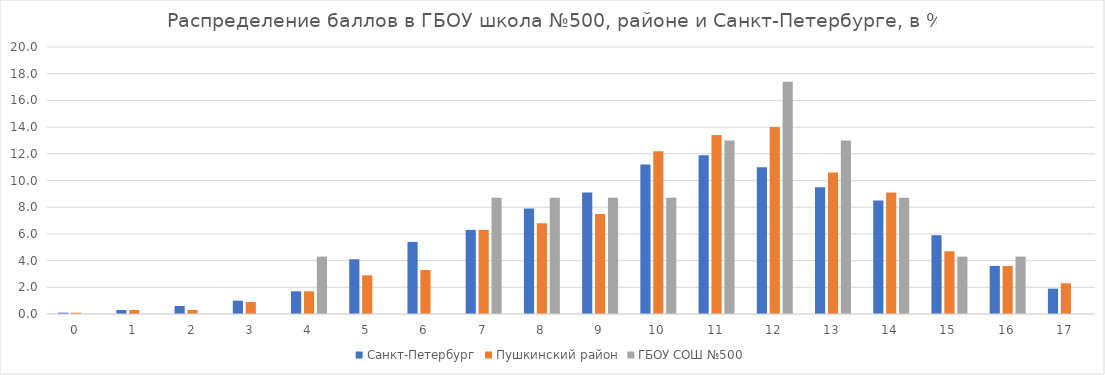
| Category | Санкт-Петербург | Пушкинский район | ГБОУ СОШ №500 |
|---|---|---|---|
| 0.0 | 0.1 | 0.1 | 0 |
| 1.0 | 0.3 | 0.3 | 0 |
| 2.0 | 0.6 | 0.3 | 0 |
| 3.0 | 1 | 0.9 | 0 |
| 4.0 | 1.7 | 1.7 | 4.3 |
| 5.0 | 4.1 | 2.9 | 0 |
| 6.0 | 5.4 | 3.3 | 0 |
| 7.0 | 6.3 | 6.3 | 8.7 |
| 8.0 | 7.9 | 6.8 | 8.7 |
| 9.0 | 9.1 | 7.5 | 8.7 |
| 10.0 | 11.2 | 12.2 | 8.7 |
| 11.0 | 11.9 | 13.4 | 13 |
| 12.0 | 11 | 14 | 17.4 |
| 13.0 | 9.5 | 10.6 | 13 |
| 14.0 | 8.5 | 9.1 | 8.7 |
| 15.0 | 5.9 | 4.7 | 4.3 |
| 16.0 | 3.6 | 3.6 | 4.3 |
| 17.0 | 1.9 | 2.3 | 0 |